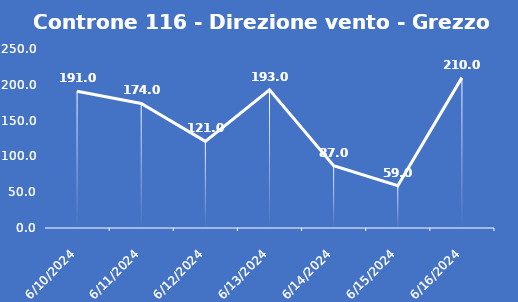
| Category | Controne 116 - Direzione vento - Grezzo (°N) |
|---|---|
| 6/10/24 | 191 |
| 6/11/24 | 174 |
| 6/12/24 | 121 |
| 6/13/24 | 193 |
| 6/14/24 | 87 |
| 6/15/24 | 59 |
| 6/16/24 | 210 |